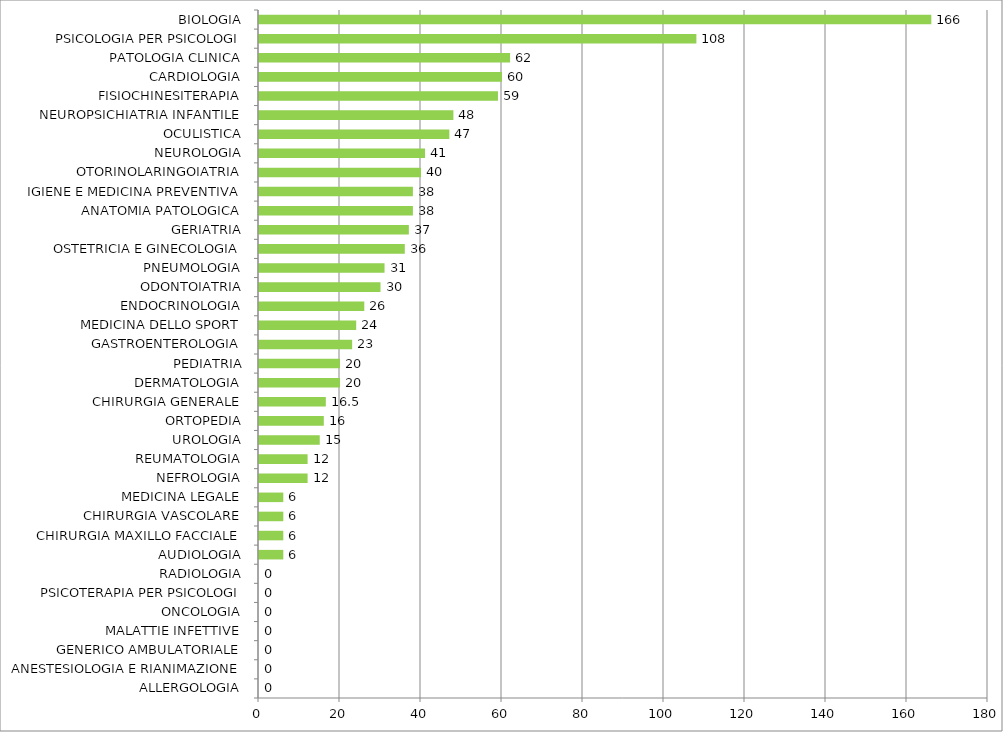
| Category | Series 0 |
|---|---|
| ALLERGOLOGIA | 0 |
| ANESTESIOLOGIA E RIANIMAZIONE | 0 |
| GENERICO AMBULATORIALE | 0 |
| MALATTIE INFETTIVE | 0 |
| ONCOLOGIA | 0 |
| PSICOTERAPIA PER PSICOLOGI | 0 |
| RADIOLOGIA | 0 |
| AUDIOLOGIA | 6 |
| CHIRURGIA MAXILLO FACCIALE | 6 |
| CHIRURGIA VASCOLARE | 6 |
| MEDICINA LEGALE | 6 |
| NEFROLOGIA | 12 |
| REUMATOLOGIA | 12 |
| UROLOGIA | 15 |
| ORTOPEDIA | 16 |
| CHIRURGIA GENERALE | 16.5 |
| DERMATOLOGIA | 20 |
| PEDIATRIA | 20 |
| GASTROENTEROLOGIA | 23 |
| MEDICINA DELLO SPORT | 24 |
| ENDOCRINOLOGIA | 26 |
| ODONTOIATRIA | 30 |
| PNEUMOLOGIA | 31 |
| OSTETRICIA E GINECOLOGIA | 36 |
| GERIATRIA | 37 |
| ANATOMIA PATOLOGICA | 38 |
| IGIENE E MEDICINA PREVENTIVA | 38 |
| OTORINOLARINGOIATRIA | 40 |
| NEUROLOGIA | 41 |
| OCULISTICA | 47 |
| NEUROPSICHIATRIA INFANTILE | 48 |
| FISIOCHINESITERAPIA | 59 |
| CARDIOLOGIA | 60 |
| PATOLOGIA CLINICA | 62 |
| PSICOLOGIA PER PSICOLOGI | 108 |
| BIOLOGIA | 166 |